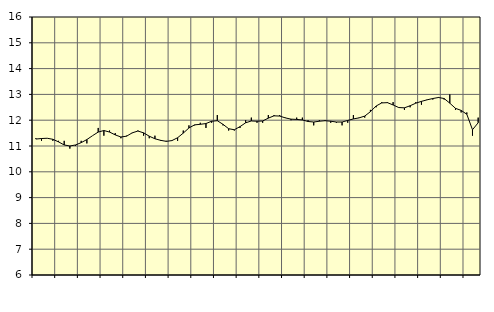
| Category | Piggar | Handel, SNI 45-47 |
|---|---|---|
| nan | 11.3 | 11.27 |
| 1.0 | 11.2 | 11.29 |
| 1.0 | 11.3 | 11.3 |
| 1.0 | 11.2 | 11.26 |
| nan | 11.2 | 11.16 |
| 2.0 | 11.2 | 11.04 |
| 2.0 | 10.9 | 11 |
| 2.0 | 11 | 11.04 |
| nan | 11.2 | 11.13 |
| 3.0 | 11.1 | 11.25 |
| 3.0 | 11.4 | 11.4 |
| 3.0 | 11.7 | 11.54 |
| nan | 11.4 | 11.6 |
| 4.0 | 11.6 | 11.54 |
| 4.0 | 11.5 | 11.43 |
| 4.0 | 11.3 | 11.35 |
| nan | 11.4 | 11.38 |
| 5.0 | 11.5 | 11.51 |
| 5.0 | 11.6 | 11.58 |
| 5.0 | 11.4 | 11.51 |
| nan | 11.3 | 11.38 |
| 6.0 | 11.4 | 11.28 |
| 6.0 | 11.2 | 11.22 |
| 6.0 | 11.2 | 11.18 |
| nan | 11.2 | 11.21 |
| 7.0 | 11.2 | 11.32 |
| 7.0 | 11.6 | 11.5 |
| 7.0 | 11.8 | 11.7 |
| nan | 11.8 | 11.82 |
| 8.0 | 11.9 | 11.84 |
| 8.0 | 11.7 | 11.87 |
| 8.0 | 11.9 | 11.96 |
| nan | 12.2 | 11.98 |
| 9.0 | 11.8 | 11.84 |
| 9.0 | 11.6 | 11.67 |
| 9.0 | 11.6 | 11.63 |
| nan | 11.7 | 11.75 |
| 10.0 | 12 | 11.9 |
| 10.0 | 12.1 | 11.97 |
| 10.0 | 11.9 | 11.96 |
| nan | 11.9 | 11.97 |
| 11.0 | 12.2 | 12.08 |
| 11.0 | 12.2 | 12.17 |
| 11.0 | 12.2 | 12.16 |
| nan | 12.1 | 12.09 |
| 12.0 | 12 | 12.04 |
| 12.0 | 12.1 | 12.03 |
| 12.0 | 12.1 | 12.01 |
| nan | 12 | 11.95 |
| 13.0 | 11.8 | 11.93 |
| 13.0 | 12 | 11.96 |
| 13.0 | 12 | 11.98 |
| nan | 11.9 | 11.96 |
| 14.0 | 11.9 | 11.93 |
| 14.0 | 11.8 | 11.93 |
| 14.0 | 11.9 | 11.99 |
| nan | 12.2 | 12.05 |
| 15.0 | 12.1 | 12.09 |
| 15.0 | 12.1 | 12.16 |
| 15.0 | 12.4 | 12.33 |
| nan | 12.5 | 12.55 |
| 16.0 | 12.7 | 12.67 |
| 16.0 | 12.7 | 12.68 |
| 16.0 | 12.7 | 12.59 |
| nan | 12.5 | 12.49 |
| 17.0 | 12.4 | 12.48 |
| 17.0 | 12.5 | 12.56 |
| 17.0 | 12.7 | 12.66 |
| nan | 12.6 | 12.73 |
| 18.0 | 12.8 | 12.79 |
| 18.0 | 12.8 | 12.84 |
| 18.0 | 12.9 | 12.88 |
| nan | 12.8 | 12.84 |
| 19.0 | 13 | 12.66 |
| 19.0 | 12.4 | 12.46 |
| 19.0 | 12.3 | 12.38 |
| nan | 12.3 | 12.23 |
| 20.0 | 11.4 | 11.63 |
| 20.0 | 12.1 | 11.9 |